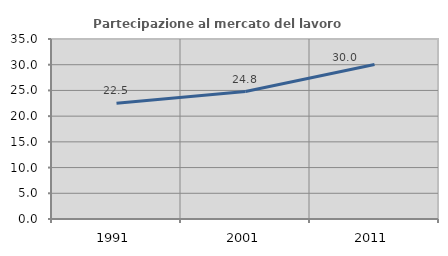
| Category | Partecipazione al mercato del lavoro  femminile |
|---|---|
| 1991.0 | 22.524 |
| 2001.0 | 24.778 |
| 2011.0 | 30.042 |